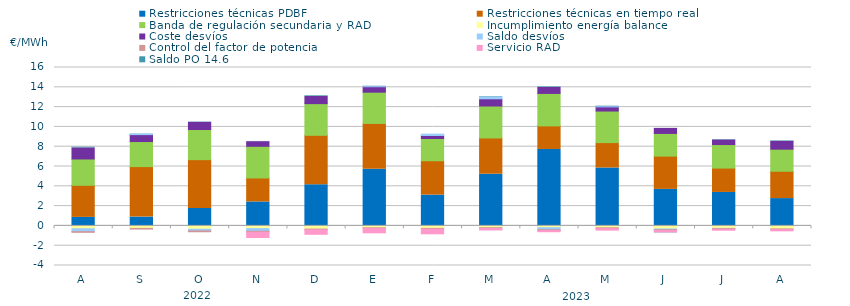
| Category | Restricciones técnicas PDBF | Restricciones técnicas en tiempo real | Banda de regulación secundaria y RAD | Incumplimiento energía balance | Coste desvíos | Saldo desvíos | Control del factor de potencia | Servicio RAD | Saldo PO 14.6 |
|---|---|---|---|---|---|---|---|---|---|
| A | 0.86 | 3.24 | 2.66 | -0.29 | 1.12 | -0.29 | -0.07 | 0 | 0.07 |
| S | 0.89 | 5.1 | 2.53 | -0.25 | 0.7 | 0.04 | -0.07 | 0 | 0.03 |
| O | 1.76 | 4.93 | 3.05 | -0.34 | 0.72 | -0.17 | -0.08 | 0 | 0.03 |
| N | 2.42 | 2.42 | 3.2 | -0.27 | 0.47 | -0.27 | -0.09 | -0.64 | 0.02 |
| D | 4.16 | 4.99 | 3.2 | -0.32 | 0.72 | 0 | -0.08 | -0.55 | 0.07 |
| E | 5.72 | 4.63 | 3.157 | -0.19 | 0.55 | 0.01 | -0.08 | -0.53 | 0.04 |
| F | 3.11 | 3.47 | 2.25 | -0.25 | 0.3 | 0.12 | -0.08 | -0.57 | 0.01 |
| M | 5.22 | 3.66 | 3.23 | -0.18 | 0.73 | 0.17 | -0.09 | -0.24 | 0.05 |
| A | 7.72 | 2.38 | 3.28 | -0.18 | 0.6 | -0.21 | -0.09 | -0.21 | 0.06 |
| M | 5.85 | 2.563 | 3.19 | -0.19 | 0.42 | 0.02 | -0.09 | -0.25 | 0.05 |
| J | 3.69 | 3.36 | 2.29 | -0.31 | 0.51 | -0.08 | -0.09 | -0.24 | -0.02 |
| J | 3.38 | 2.46 | 2.376 | -0.25 | 0.47 | -0.02 | -0.07 | -0.2 | 0.04 |
| A | 2.76 | 2.76 | 2.23 | -0.3 | 0.79 | 0 | -0.08 | -0.22 | 0.05 |